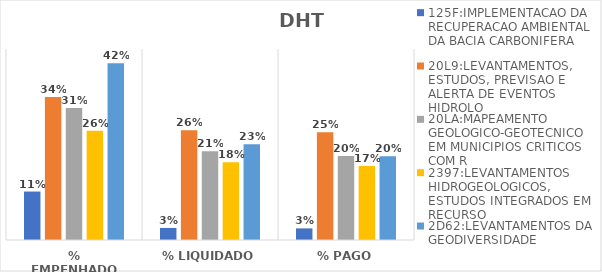
| Category | 125F:IMPLEMENTACAO DA RECUPERACAO AMBIENTAL DA BACIA CARBONIFERA | 20L9:LEVANTAMENTOS, ESTUDOS, PREVISAO E ALERTA DE EVENTOS HIDROLO | 20LA:MAPEAMENTO GEOLOGICO-GEOTECNICO EM MUNICIPIOS CRITICOS COM R | 2397:LEVANTAMENTOS HIDROGEOLOGICOS, ESTUDOS INTEGRADOS EM RECURSO | 2D62:LEVANTAMENTOS DA GEODIVERSIDADE |
|---|---|---|---|---|---|
| % EMPENHADO | 0.114 | 0.337 | 0.311 | 0.258 | 0.417 |
| % LIQUIDADO | 0.028 | 0.259 | 0.209 | 0.183 | 0.226 |
| % PAGO | 0.027 | 0.254 | 0.198 | 0.174 | 0.197 |